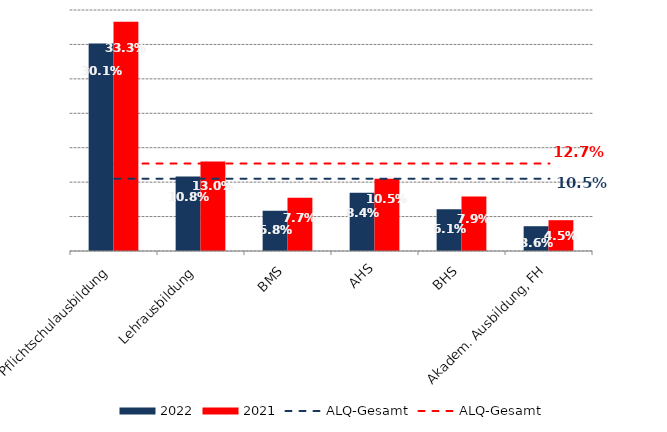
| Category | 2022 | 2021 |
|---|---|---|
| Pflichtschulausbildung | 0.301 | 0.333 |
| Lehrausbildung | 0.108 | 0.13 |
| BMS | 0.058 | 0.077 |
| AHS | 0.084 | 0.105 |
| BHS | 0.061 | 0.079 |
| Akadem. Ausbildung, FH | 0.036 | 0.045 |